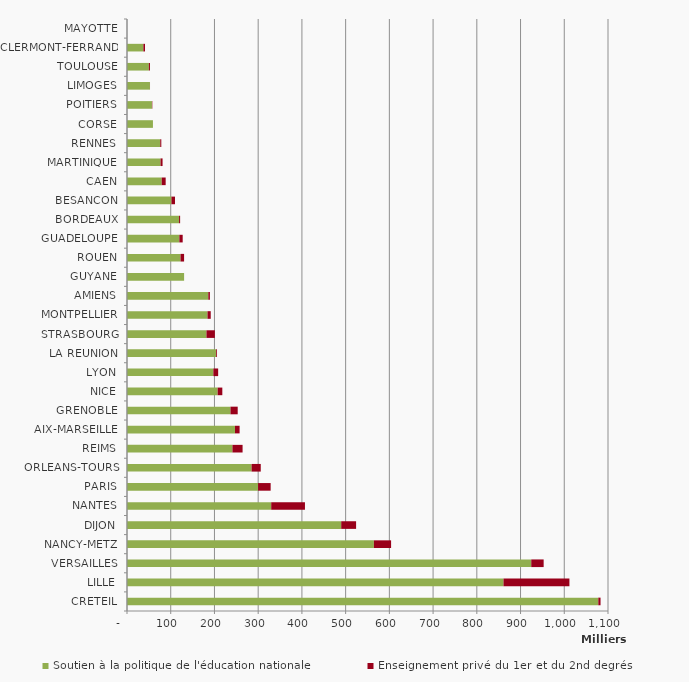
| Category | Soutien à la politique de l'éducation nationale | Enseignement privé du 1er et du 2nd degrés |
|---|---|---|
| CRETEIL | 1077850.04 | 5088 |
| LILLE | 861038 | 150731 |
| VERSAILLES | 924480.06 | 28361 |
| NANCY-METZ | 564579.16 | 39381 |
| DIJON | 489892.75 | 34030.9 |
| NANTES | 329816 | 77157 |
| PARIS | 299701 | 28830 |
| ORLEANS-TOURS | 284880.82 | 20994 |
| REIMS | 241130.05 | 23198 |
| AIX-MARSEILLE | 246966.37 | 10555 |
| GRENOBLE | 236683.2 | 16486 |
| NICE | 207347.32 | 10646 |
| LYON | 197480.8 | 11000 |
| LA REUNION | 203973 | 1880 |
| STRASBOURG | 181699.35 | 19229 |
| MONTPELLIER | 184094.93 | 7396 |
| AMIENS | 185944.9 | 3610 |
| GUYANE | 130600 | 0 |
| ROUEN | 122462.46 | 8092 |
| GUADELOUPE | 119718.2 | 7639 |
| BORDEAUX | 119063.33 | 2419 |
| BESANCON | 101696.9 | 8041 |
| CAEN | 79332.89 | 9094 |
| MARTINIQUE | 76741.79 | 4595 |
| RENNES | 76007.81 | 2450 |
| CORSE | 59326.67 | 0 |
| POITIERS | 57073.03 | 822 |
| LIMOGES | 52478.22 | 140 |
| TOULOUSE | 49997.6 | 2510 |
| CLERMONT-FERRAND | 37443.04 | 3769 |
| MAYOTTE | 0 | 0 |